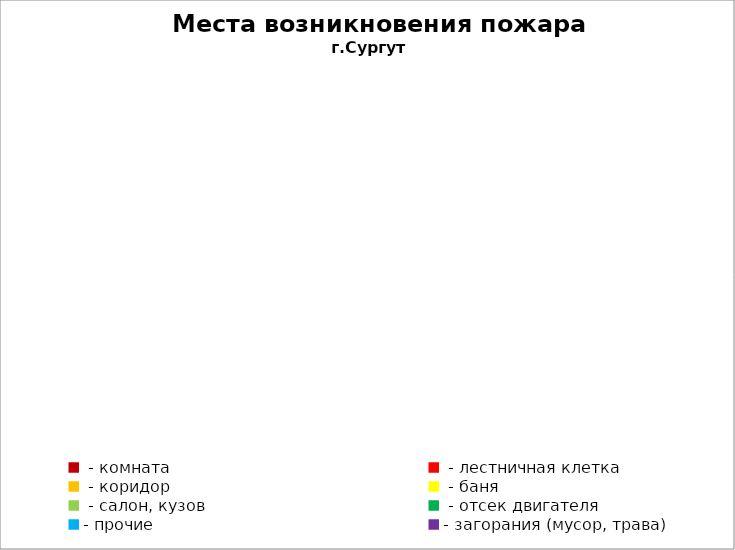
| Category | Места возникновения пожара |
|---|---|
|  - комната | 56 |
|  - лестничная клетка | 8 |
|  - коридор | 4 |
|  - баня | 26 |
|  - салон, кузов | 12 |
|  - отсек двигателя | 33 |
| - прочие | 89 |
| - загорания (мусор, трава)  | 111 |